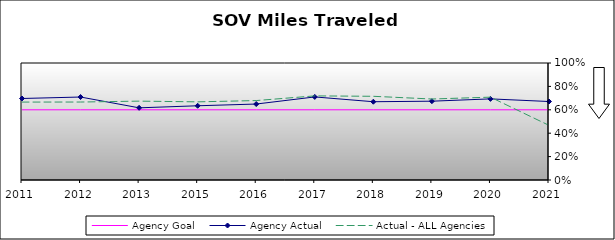
| Category | Agency Goal | Agency Actual | Actual - ALL Agencies |
|---|---|---|---|
| 2011.0 | 0.6 | 0.697 | 0.666 |
| 2012.0 | 0.6 | 0.709 | 0.666 |
| 2013.0 | 0.6 | 0.617 | 0.674 |
| 2015.0 | 0.6 | 0.634 | 0.668 |
| 2016.0 | 0.6 | 0.649 | 0.679 |
| 2017.0 | 0.6 | 0.71 | 0.719 |
| 2018.0 | 0.6 | 0.669 | 0.715 |
| 2019.0 | 0.6 | 0.674 | 0.692 |
| 2020.0 | 0.6 | 0.693 | 0.708 |
| 2021.0 | 0.6 | 0.671 | 0.467 |